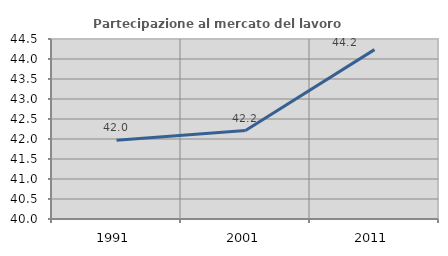
| Category | Partecipazione al mercato del lavoro  femminile |
|---|---|
| 1991.0 | 41.967 |
| 2001.0 | 42.211 |
| 2011.0 | 44.235 |